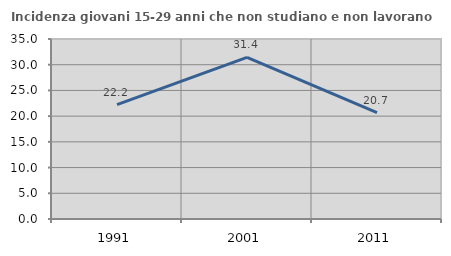
| Category | Incidenza giovani 15-29 anni che non studiano e non lavorano  |
|---|---|
| 1991.0 | 22.222 |
| 2001.0 | 31.429 |
| 2011.0 | 20.683 |